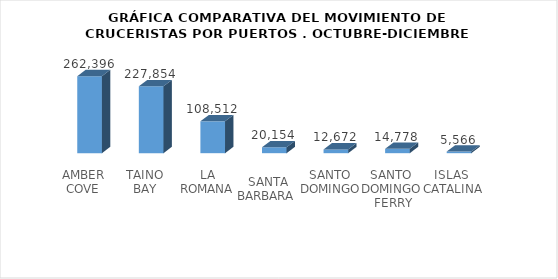
| Category | Series 0 |
|---|---|
| AMBER COVE | 262396 |
| TAINO BAY | 227854 |
| LA ROMANA | 108512 |
| SANTA BARBARA  | 20154 |
| SANTO DOMINGO | 12672 |
| SANTO DOMINGO  FERRY | 14778 |
| ISLAS  CATALINA  | 5566 |